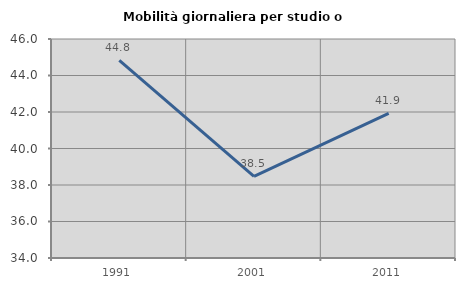
| Category | Mobilità giornaliera per studio o lavoro |
|---|---|
| 1991.0 | 44.831 |
| 2001.0 | 38.476 |
| 2011.0 | 41.922 |